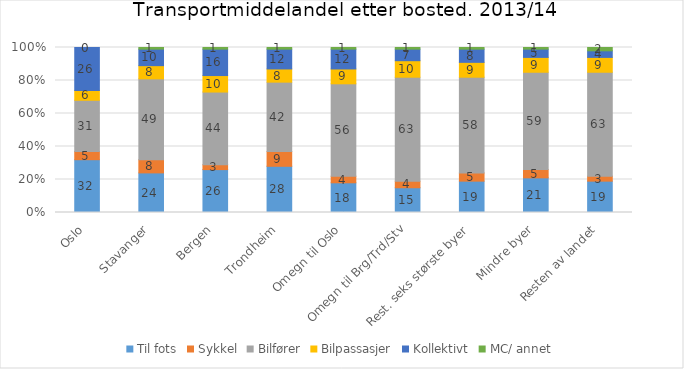
| Category | Til fots | Sykkel | Bilfører | Bilpassasjer | Kollektivt | MC/ annet |
|---|---|---|---|---|---|---|
| Oslo | 32 | 5 | 31 | 6 | 26 | 0 |
| Stavanger | 24 | 8 | 49 | 8 | 10 | 1 |
| Bergen | 26 | 3 | 44 | 10 | 16 | 1 |
| Trondheim | 28 | 9 | 42 | 8 | 12 | 1 |
| Omegn til Oslo | 18 | 4 | 56 | 9 | 12 | 1 |
| Omegn til Brg/Trd/Stv | 15 | 4 | 63 | 10 | 7 | 1 |
| Rest. seks største byer | 19 | 5 | 58 | 9 | 8 | 1 |
| Mindre byer | 21 | 5 | 59 | 9 | 5 | 1 |
| Resten av landet | 19 | 3 | 63 | 9 | 4 | 2 |